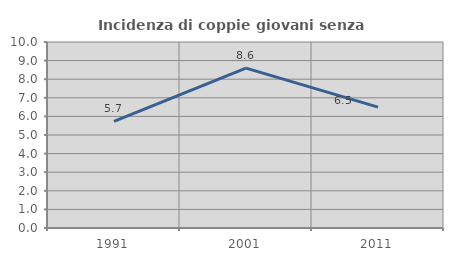
| Category | Incidenza di coppie giovani senza figli |
|---|---|
| 1991.0 | 5.738 |
| 2001.0 | 8.594 |
| 2011.0 | 6.5 |